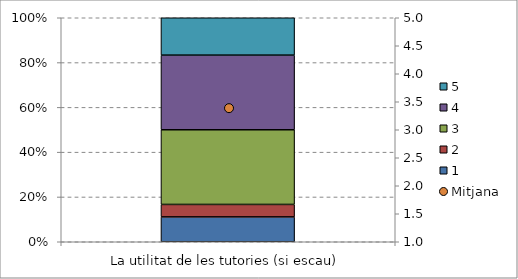
| Category | 1 | 2 | 3 | 4 | 5 |
|---|---|---|---|---|---|
| La utilitat de les tutories (si escau) | 0.111 | 0.056 | 0.333 | 0.333 | 0.167 |